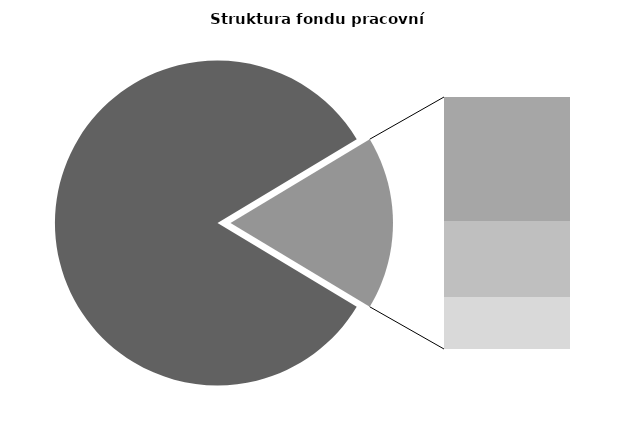
| Category | Series 0 |
|---|---|
| Průměrná měsíční odpracovaná doba bez přesčasu | 139.645 |
| Dovolená | 14.309 |
| Nemoc | 8.785 |
| Jiné | 6.006 |